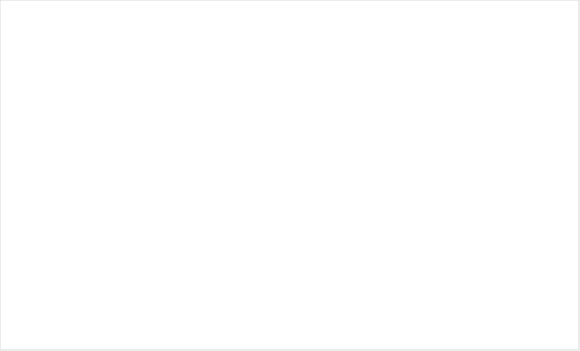
| Category | Итог |
|---|---|
| Так | 16 |